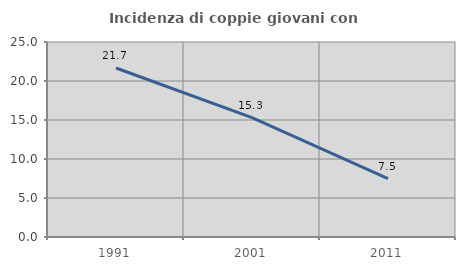
| Category | Incidenza di coppie giovani con figli |
|---|---|
| 1991.0 | 21.667 |
| 2001.0 | 15.315 |
| 2011.0 | 7.475 |